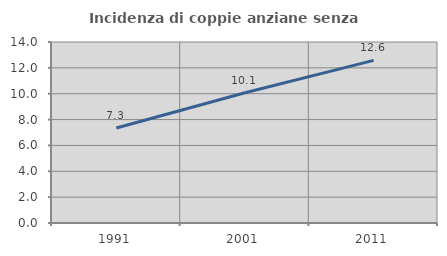
| Category | Incidenza di coppie anziane senza figli  |
|---|---|
| 1991.0 | 7.349 |
| 2001.0 | 10.07 |
| 2011.0 | 12.58 |